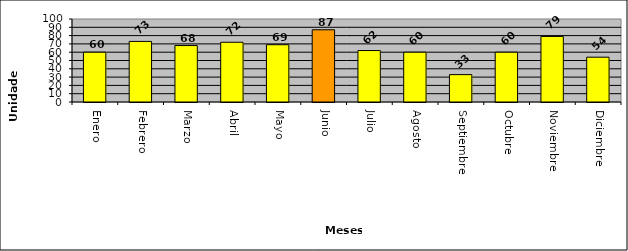
| Category | Dominicanos deportados |
|---|---|
| Enero | 60 |
| Febrero | 73 |
| Marzo | 68 |
| Abril | 72 |
| Mayo | 69 |
| Junio | 87 |
| Julio | 62 |
| Agosto | 60 |
| Septiembre | 33 |
| Octubre | 60 |
| Noviembre | 79 |
| Diciembre | 54 |